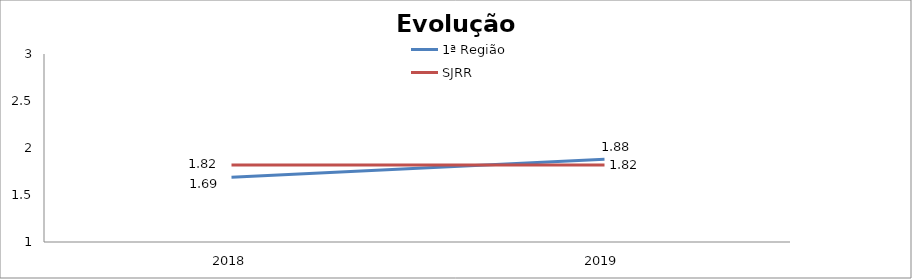
| Category | 1ª Região | SJRR |
|---|---|---|
| 2018.0 | 1.69 | 1.82 |
| 2019.0 | 1.88 | 1.82 |